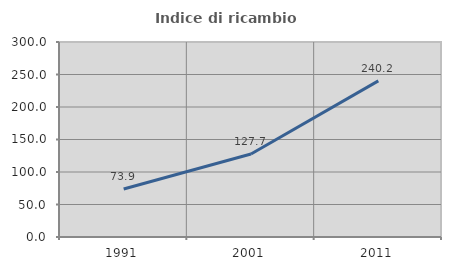
| Category | Indice di ricambio occupazionale  |
|---|---|
| 1991.0 | 73.872 |
| 2001.0 | 127.732 |
| 2011.0 | 240.24 |